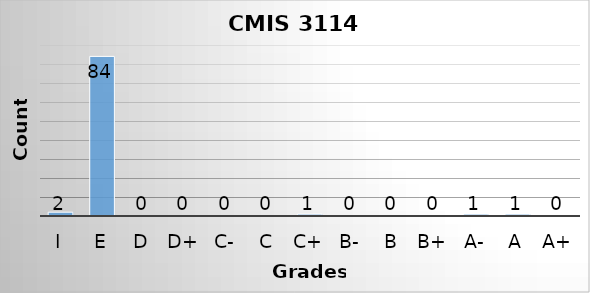
| Category | Series 0 |
|---|---|
| I | 2 |
| E | 84 |
| D | 0 |
| D+ | 0 |
| C- | 0 |
| C | 0 |
| C+ | 1 |
| B- | 0 |
| B | 0 |
| B+ | 0 |
| A- | 1 |
| A | 1 |
| A+ | 0 |